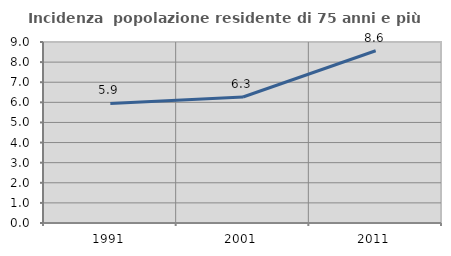
| Category | Incidenza  popolazione residente di 75 anni e più |
|---|---|
| 1991.0 | 5.944 |
| 2001.0 | 6.264 |
| 2011.0 | 8.566 |